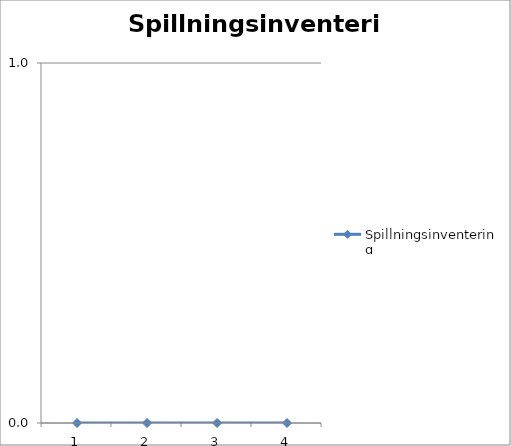
| Category | Spillningsinventering |
|---|---|
| 0 | 0 |
| 1 | 0 |
| 2 | 0 |
| 3 | 0 |